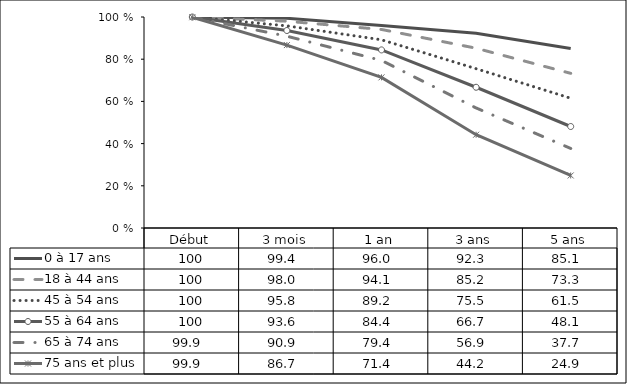
| Category | 0 à 17 ans | 18 à 44 ans  | 45 à 54 ans  | 55 à 64 ans  | 65 à 74 ans  | 75 ans et plus  |
|---|---|---|---|---|---|---|
| Début | 100 | 100 | 100 | 100 | 99.9 | 99.9 |
| 3 mois | 99.4 | 98 | 95.8 | 93.6 | 90.9 | 86.7 |
| 1 an | 96 | 94.1 | 89.2 | 84.4 | 79.4 | 71.4 |
| 3 ans | 92.3 | 85.2 | 75.5 | 66.7 | 56.9 | 44.2 |
| 5 ans | 85.1 | 73.3 | 61.5 | 48.1 | 37.7 | 24.9 |